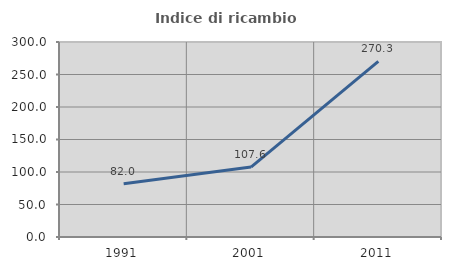
| Category | Indice di ricambio occupazionale  |
|---|---|
| 1991.0 | 81.962 |
| 2001.0 | 107.623 |
| 2011.0 | 270.312 |